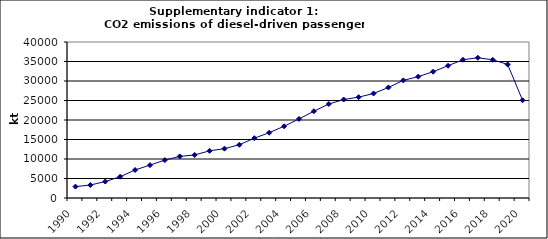
| Category | CO2 emissions of diesel-driven passenger cars, kt |
|---|---|
| 1990 | 2924.206 |
| 1991 | 3322.4 |
| 1992 | 4218.579 |
| 1993 | 5453.778 |
| 1994 | 7184.298 |
| 1995 | 8434.884 |
| 1996 | 9713.784 |
| 1997 | 10672.265 |
| 1998 | 11040.676 |
| 1999 | 12094.246 |
| 2000 | 12653.128 |
| 2001 | 13651.782 |
| 2002 | 15335.104 |
| 2003 | 16742.027 |
| 2004 | 18394.609 |
| 2005 | 20258.974 |
| 2006 | 22254.174 |
| 2007 | 24105.03 |
| 2008 | 25245.801 |
| 2009 | 25855.37 |
| 2010 | 26796.094 |
| 2011 | 28343.758 |
| 2012 | 30163.546 |
| 2013 | 31116.523 |
| 2014 | 32382.004 |
| 2015 | 33917.992 |
| 2016 | 35448.276 |
| 2017 | 35958.485 |
| 2018 | 35437.667 |
| 2019 | 34247.855 |
| 2020 | 25055.274 |